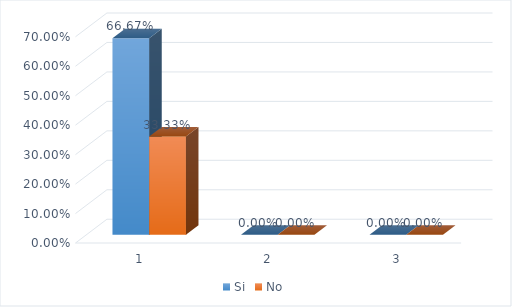
| Category | Si | No |
|---|---|---|
| 0 | 0.667 | 0.333 |
| 1 | 0 | 0 |
| 2 | 0 | 0 |